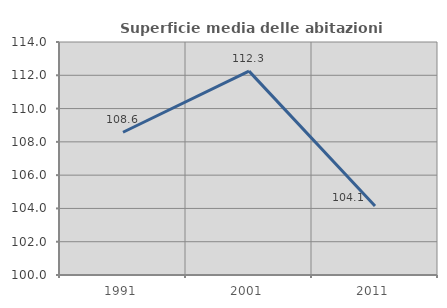
| Category | Superficie media delle abitazioni occupate |
|---|---|
| 1991.0 | 108.576 |
| 2001.0 | 112.25 |
| 2011.0 | 104.149 |